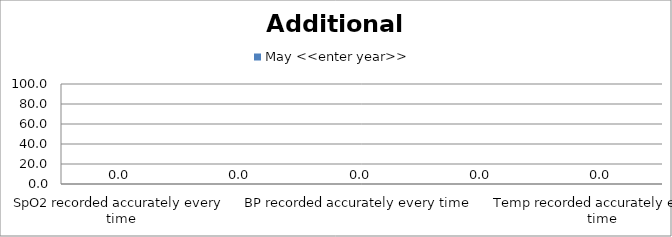
| Category | May <<enter year>> |
|---|---|
| SpO2 recorded accurately every time | 0 |
| CRT recorded accurately every time | 0 |
| BP recorded accurately every time | 0 |
| Skin Colour recorded accurately every time | 0 |
| Temp recorded accurately every time | 0 |